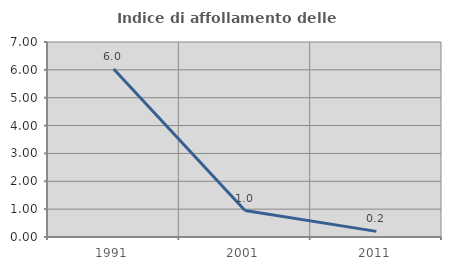
| Category | Indice di affollamento delle abitazioni  |
|---|---|
| 1991.0 | 6.028 |
| 2001.0 | 0.951 |
| 2011.0 | 0.202 |